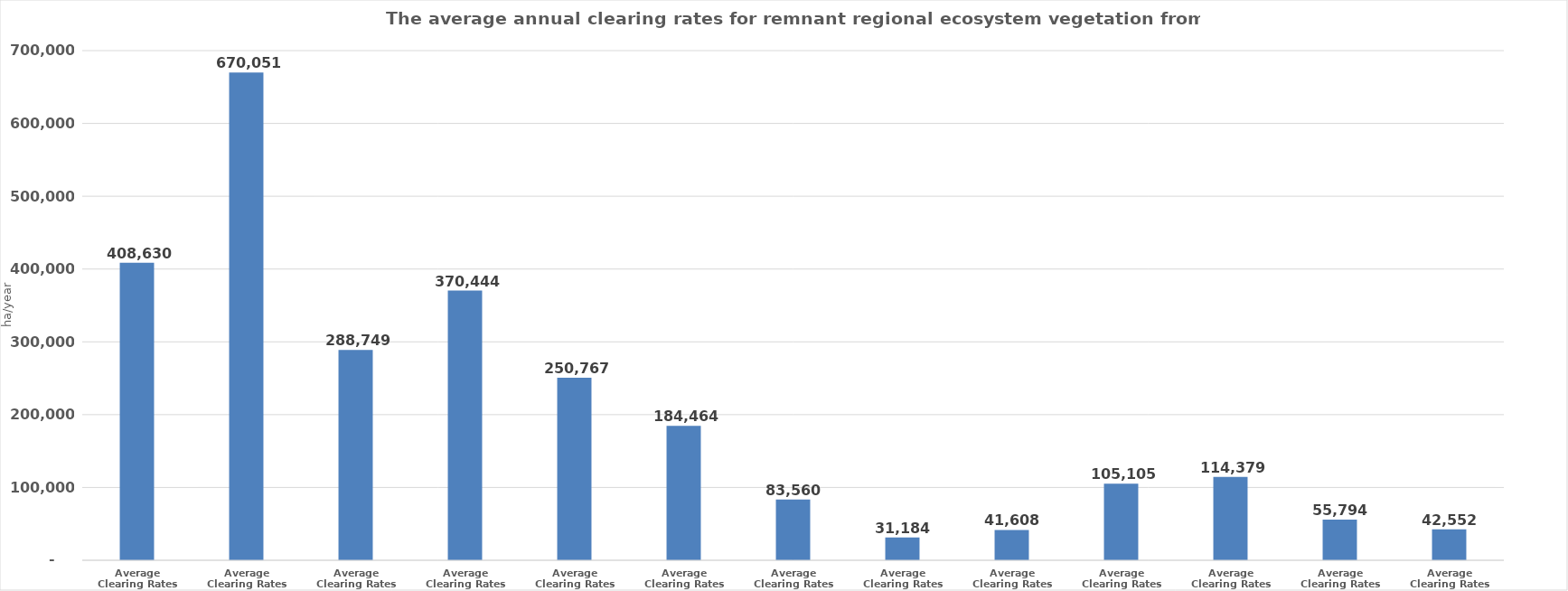
| Category | Series 0 |
|---|---|
| Average Clearing Rates 97-99 | 408630.201 |
| Average Clearing Rates 99-00  | 670050.84 |
| Average Clearing Rates 00-01  | 288749.227 |
| Average Clearing Rates 01-03  | 370444.335 |
| Average Clearing Rates 03-05  | 250766.805 |
| Average Clearing Rates 05-06b  | 184464.125 |
| Average Clearing Rates 06b-09  | 83560.439 |
| Average Clearing Rates 09-11  | 31184.211 |
| Average Clearing Rates 11-13  | 41607.962 |
| Average Clearing Rates 13-15  | 105105.298 |
| Average Clearing Rates 15-17  | 114378.567 |
| Average Clearing Rates 17-19  | 55794.095 |
| Average Clearing Rates 19-21  | 42551.828 |